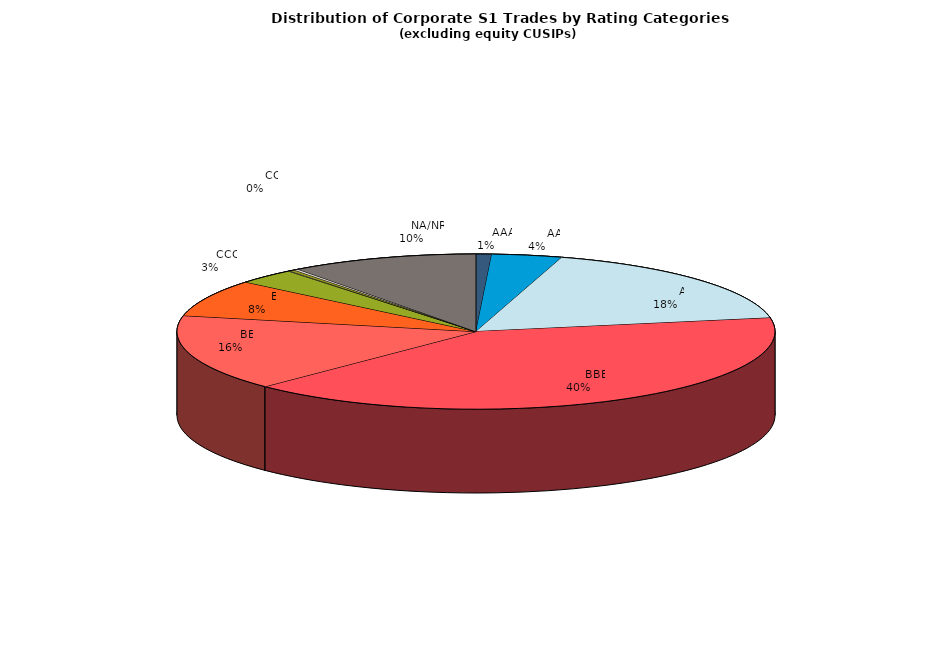
| Category | Series 0 |
|---|---|
|         AAA | 577.439 |
|         AA | 2593.154 |
|         A | 11975.198 |
|         BBB | 27516.581 |
|         BB | 10818.534 |
|         B | 5267.115 |
|         CCC | 2191.277 |
|         CC | 55.704 |
|         C | 206.617 |
|         D | 169.656 |
|         NA/NR | 6929.632 |